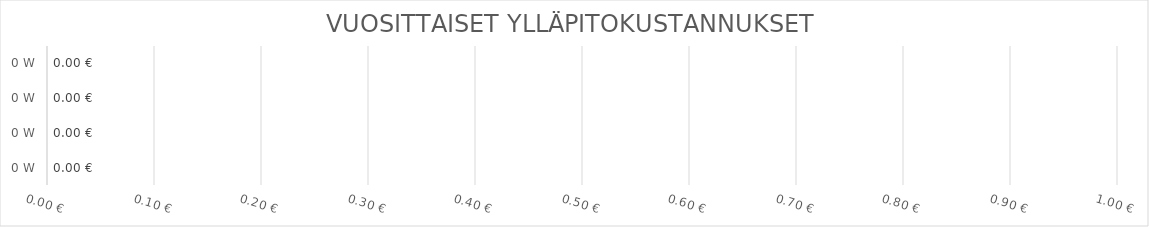
| Category | VUOSITTAISET ENERGIAKUSTANNUKSET €/KWH  |
|---|---|
| 0.0 | 0 |
| 0.0 | 0 |
| 0.0 | 0 |
| 0.0 | 0 |